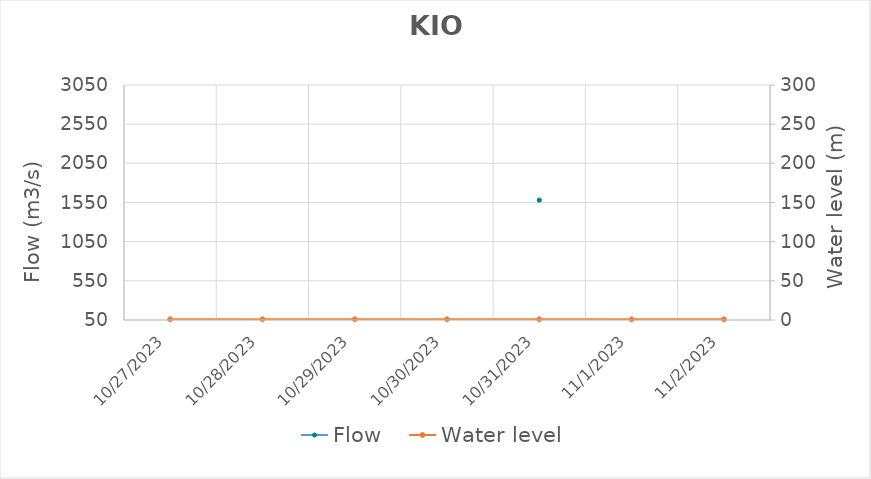
| Category | Flow |
|---|---|
| 7/20/23 | 639.81 |
| 7/19/23 | 656.78 |
| 7/18/23 | 679.71 |
| 7/17/23 | 692.48 |
| 7/16/23 | 698.58 |
| 7/15/23 | 673.88 |
| 7/14/23 | 734.71 |